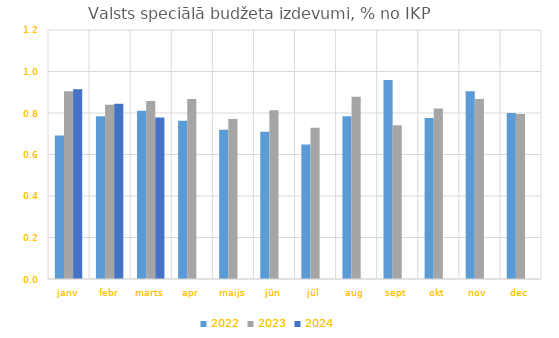
| Category | 2022 | 2023 | 2024 |
|---|---|---|---|
| janv | 0.691 | 0.904 | 0.914 |
| febr | 0.784 | 0.84 | 0.845 |
| marts | 0.811 | 0.858 | 0.779 |
| apr | 0.763 | 0.867 | 0 |
| maijs | 0.719 | 0.771 | 0 |
| jūn | 0.71 | 0.813 | 0 |
| jūl | 0.648 | 0.729 | 0 |
| aug | 0.784 | 0.879 | 0 |
| sept | 0.959 | 0.741 | 0 |
| okt | 0.776 | 0.822 | 0 |
| nov | 0.905 | 0.867 | 0 |
| dec | 0.8 | 0.795 | 0 |